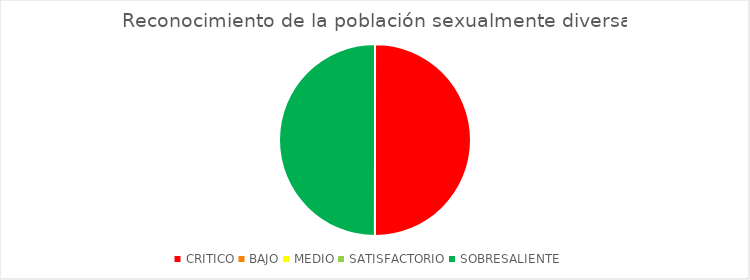
| Category | Reconocimiento de la población sexualmente diversa |
|---|---|
| CRITICO | 1 |
| BAJO | 0 |
| MEDIO | 0 |
| SATISFACTORIO | 0 |
| SOBRESALIENTE | 1 |